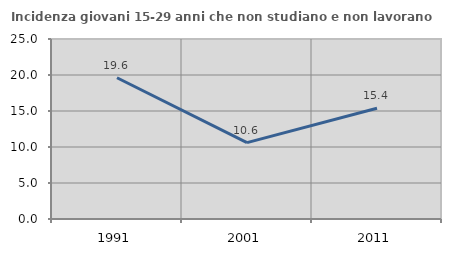
| Category | Incidenza giovani 15-29 anni che non studiano e non lavorano  |
|---|---|
| 1991.0 | 19.62 |
| 2001.0 | 10.603 |
| 2011.0 | 15.385 |